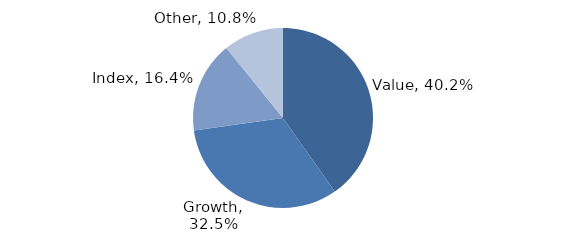
| Category | Investment Style |
|---|---|
| Value | 0.402 |
| Growth | 0.325 |
| Index | 0.164 |
| Other | 0.108 |